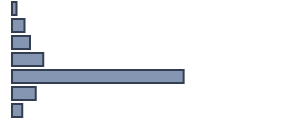
| Category | Series 0 |
|---|---|
| 0 | 1.7 |
| 1 | 4.6 |
| 2 | 6.6 |
| 3 | 11.5 |
| 4 | 63.1 |
| 5 | 8.7 |
| 6 | 3.8 |